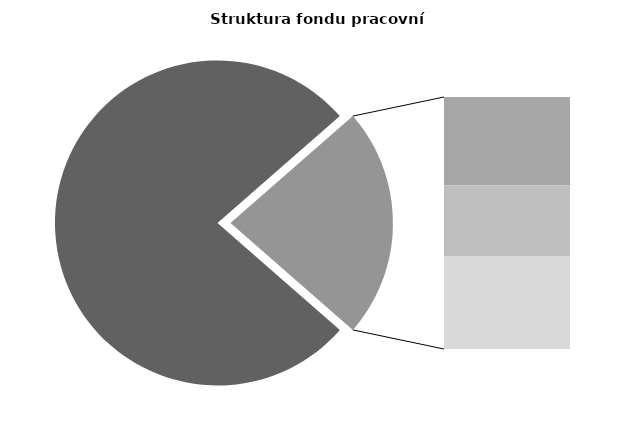
| Category | Series 0 |
|---|---|
| Průměrná měsíční odpracovaná doba bez přesčasu | 132.212 |
| Dovolená | 13.726 |
| Nemoc | 11.078 |
| Jiné | 14.377 |